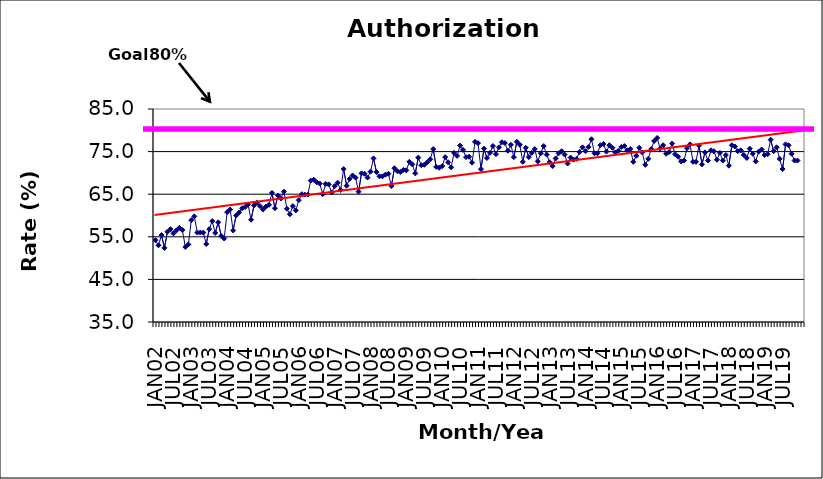
| Category | Series 0 |
|---|---|
| JAN02 | 54.2 |
| FEB02 | 53 |
| MAR02 | 55.4 |
| APR02 | 52.4 |
| MAY02 | 56.2 |
| JUN02 | 56.8 |
| JUL02 | 55.8 |
| AUG02 | 56.5 |
| SEP02 | 57.1 |
| OCT02 | 56.6 |
| NOV02 | 52.6 |
| DEC02 | 53.2 |
| JAN03 | 58.9 |
| FEB03 | 59.8 |
| MAR03 | 56 |
| APR03 | 56 |
| MAY03 | 56 |
| JUN03 | 53.3 |
| JUL03 | 56.8 |
| AUG03 | 58.7 |
| SEP03 | 55.9 |
| OCT03 | 58.4 |
| NOV03 | 55.2 |
| DEC03 | 54.6 |
| JAN04 | 60.8 |
| FEB04 | 61.4 |
| MAR04 | 56.5 |
| APR04 | 60 |
| MAY04 | 60.7 |
| JUN04 | 61.7 |
| JUL04 | 62 |
| AUG04 | 62.6 |
| SEP04 | 59 |
| OCT04 | 62.4 |
| NOV04 | 63 |
| DEC04 | 62.2 |
| JAN05 | 61.4 |
| FEB05 | 62.1 |
| MAR05 | 62.5 |
| APR05 | 65.3 |
| MAY05 | 61.7 |
| JUN05 | 64.7 |
| JUL05 | 64 |
| AUG05 | 65.6 |
| SEP05 | 61.6 |
| OCT05 | 60.3 |
| NOV05 | 62.2 |
| DEC05 | 61.2 |
| JAN06 | 63.6 |
| FEB06 | 65 |
| MAR06 | 64.9 |
| APR06 | 64.9 |
| MAY06 | 68.2 |
| JUN06 | 68.4 |
| JUL06 | 67.8 |
| AUG06 | 67.5 |
| SEP06 | 65 |
| OCT06 | 67.4 |
| NOV06 | 67.3 |
| DEC06 | 65.4 |
| JAN07 | 66.9 |
| FEB07 | 67.7 |
| MAR07 | 66 |
| APR07 | 70.9 |
| MAY07 | 67 |
| JUN07 | 68.6 |
| JUL07 | 69.4 |
| AUG07 | 68.9 |
| SEP07 | 65.6 |
| OCT07 | 69.9 |
| NOV07 | 69.8 |
| DEC07 | 68.9 |
| JAN08 | 70.3 |
| FEB08 | 73.4 |
| MAR08 | 70.2 |
| APR08 | 69.2 |
| MAY08 | 69.2 |
| JUN08 | 69.6 |
| JUL08 | 69.8 |
| AUG08 | 66.9 |
| SEP08 | 71.1 |
| OCT08 | 70.4 |
| NOV08 | 70.2 |
| DEC08 | 70.7 |
| JAN09 | 70.6 |
| FEB09 | 72.6 |
| MAR09 | 72 |
| APR09 | 69.9 |
| MAY09 | 73.6 |
| JUN09 | 71.8 |
| JUL09 | 71.9 |
| AUG09 | 72.5 |
| SEP09 | 73.2 |
| OCT09 | 75.6 |
| NOV09 | 71.4 |
| DEC09 | 71.2 |
| JAN10 | 71.6 |
| FEB10 | 73.7 |
| MAR10 | 72.5 |
| APR10 | 71.3 |
| MAY10 | 74.7 |
| JUN10 | 74 |
| JUL10 | 76.4 |
| AUG10 | 75.4 |
| SEP10 | 73.7 |
| OCT10 | 73.8 |
| NOV10 | 72.4 |
| DEC10 | 77.3 |
| JAN11 | 77 |
| FEB11 | 70.9 |
| MAR11 | 75.7 |
| APR11 | 73.5 |
| MAY11 | 74.7 |
| JUN11 | 76.3 |
| JUL11 | 74.4 |
| AUG11 | 76 |
| SEP11 | 77.2 |
| OCT11 | 77 |
| NOV11 | 75.2 |
| DEC11 | 76.6 |
| JAN12 | 73.7 |
| FEB12 | 77.3 |
| MAR12 | 76.6 |
| APR12 | 72.6 |
| MAY12 | 75.9 |
| JUN12 | 73.7 |
| JUL12 | 74.7 |
| AUG12 | 75.6 |
| SEP12 | 72.7 |
| OCT12 | 74.6 |
| NOV12 | 76.3 |
| DEC12 | 74.3 |
| JAN13 | 72.5 |
| FEB13 | 71.6 |
| MAR13 | 73.4 |
| APR13 | 74.6 |
| MAY13 | 75.1 |
| JUN13 | 74.3 |
| JUL13 | 72.2 |
| AUG13 | 73.6 |
| SEP13 | 73.1 |
| OCT13 | 73.3 |
| NOV13 | 74.9 |
| DEC13 | 76 |
| JAN14 | 75.1 |
| FEB14 | 76.1 |
| MAR14 | 77.9 |
| APR14 | 74.6 |
| MAY14 | 74.6 |
| JUN14 | 76.5 |
| JUL14 | 76.8 |
| AUG14 | 75 |
| SEP14 | 76.5 |
| OCT14 | 75.9 |
| NOV14 | 74.8 |
| DEC14 | 75.2 |
| JAN15 | 76.1 |
| FEB15 | 76.3 |
| MAR15 | 75.3 |
| APR15 | 75.6 |
| MAY15 | 72.6 |
| JUN15 | 74 |
| JUL15 | 75.9 |
| AUG15 | 74.8 |
| SEP15 | 71.9 |
| OCT15 | 73.3 |
| NOV15 | 75.6 |
| DEC15 | 77.5 |
| JAN16 | 78.2 |
| FEB16 | 75.7 |
| MAR16 | 76.5 |
| APR16 | 74.5 |
| MAY16 | 74.9 |
| JUN16 | 76.9 |
| JUL16 | 74.4 |
| AUG16 | 73.8 |
| SEP16 | 72.7 |
| OCT16 | 72.9 |
| NOV16 | 75.8 |
| DEC16 | 76.7 |
| JAN17 | 72.6 |
| FEB17 | 72.6 |
| MAR17 | 76.4 |
| APR17 | 72 |
| MAY17 | 74.8 |
| JUN17 | 72.9 |
| JUL17 | 75.3 |
| AUG17 | 75.1 |
| SEP17 | 73.1 |
| OCT17 | 74.7 |
| NOV17 | 72.9 |
| DEC17 | 74.2 |
| JAN18 | 71.7 |
| FEB18 | 76.5 |
| MAR18 | 76.2 |
| APR18 | 75.1 |
| MAY18 | 75.3 |
| JUN18 | 74.2 |
| JUL18 | 73.5 |
| AUG18 | 75.7 |
| SEP18 | 74.5 |
| OCT18 | 72.7 |
| NOV18 | 75 |
| DEC18 | 75.5 |
| JAN19 | 74.2 |
| FEB19 | 74.4 |
| MAR19 | 77.8 |
| APR19 | 75.1 |
| MAY19 | 76 |
| JUN19 | 73.3 |
| JUL19 | 70.9 |
| AUG19 | 76.7 |
| SEP19 | 76.5 |
| OCT19 | 74.5 |
| NOV19 | 72.9 |
| DEC19 | 72.9 |